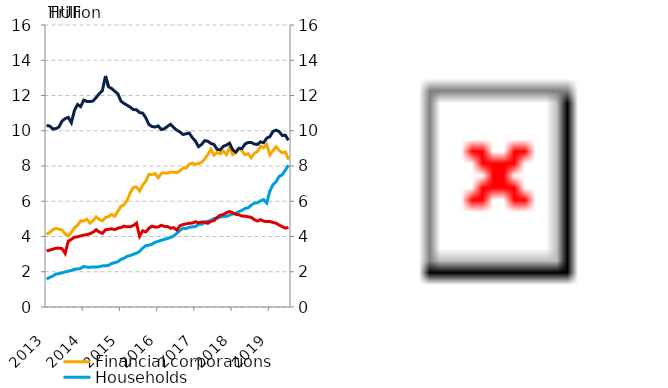
| Category | Financial corporations | Households |
|---|---|---|
| 2013-06-30 | 4.122 | 1.58 |
| 2013-07-31 | 4.225 | 1.681 |
| 2013-08-31 | 4.38 | 1.75 |
| 2013-09-30 | 4.46 | 1.872 |
| 2013-10-31 | 4.414 | 1.893 |
| 2013-11-30 | 4.366 | 1.935 |
| 2013-12-31 | 4.145 | 1.991 |
| 2014-01-31 | 4.032 | 2.036 |
| 2014-02-28 | 4.224 | 2.07 |
| 2014-03-31 | 4.491 | 2.148 |
| 2014-04-30 | 4.631 | 2.151 |
| 2014-05-31 | 4.888 | 2.186 |
| 2014-06-30 | 4.883 | 2.301 |
| 2014-07-31 | 4.984 | 2.265 |
| 2014-08-31 | 4.755 | 2.248 |
| 2014-09-30 | 4.91 | 2.27 |
| 2014-10-31 | 5.11 | 2.262 |
| 2014-11-30 | 4.966 | 2.287 |
| 2014-12-31 | 4.888 | 2.333 |
| 2015-01-31 | 5.077 | 2.336 |
| 2015-02-28 | 5.129 | 2.364 |
| 2015-03-31 | 5.259 | 2.472 |
| 2015-04-30 | 5.15 | 2.514 |
| 2015-05-31 | 5.437 | 2.57 |
| 2015-06-30 | 5.703 | 2.704 |
| 2015-07-31 | 5.799 | 2.766 |
| 2015-08-31 | 6.047 | 2.879 |
| 2015-09-30 | 6.487 | 2.922 |
| 2015-10-31 | 6.783 | 2.995 |
| 2015-11-30 | 6.806 | 3.051 |
| 2015-12-31 | 6.583 | 3.16 |
| 2016-01-31 | 6.924 | 3.34 |
| 2016-02-29 | 7.136 | 3.482 |
| 2016-03-31 | 7.526 | 3.506 |
| 2016-04-30 | 7.517 | 3.568 |
| 2016-05-31 | 7.568 | 3.667 |
| 2016-06-30 | 7.337 | 3.726 |
| 2016-07-31 | 7.579 | 3.779 |
| 2016-08-31 | 7.612 | 3.836 |
| 2016-09-30 | 7.589 | 3.888 |
| 2016-10-31 | 7.655 | 3.95 |
| 2016-11-30 | 7.646 | 4.034 |
| 2016-12-31 | 7.618 | 4.179 |
| 2017-01-31 | 7.727 | 4.344 |
| 2017-02-28 | 7.889 | 4.469 |
| 2017-03-31 | 7.879 | 4.451 |
| 2017-04-30 | 8.097 | 4.52 |
| 2017-05-31 | 8.164 | 4.543 |
| 2017-06-30 | 8.095 | 4.566 |
| 2017-07-31 | 8.135 | 4.683 |
| 2017-08-31 | 8.206 | 4.698 |
| 2017-09-30 | 8.405 | 4.767 |
| 2017-10-31 | 8.643 | 4.874 |
| 2017-11-30 | 8.949 | 4.902 |
| 2017-12-31 | 8.613 | 5.025 |
| 2018-01-31 | 8.768 | 5.04 |
| 2018-02-28 | 8.688 | 5.098 |
| 2018-03-31 | 8.833 | 5.132 |
| 2018-04-30 | 8.649 | 5.14 |
| 2018-05-31 | 9.028 | 5.208 |
| 2018-06-30 | 8.647 | 5.282 |
| 2018-07-31 | 8.762 | 5.324 |
| 2018-08-31 | 8.959 | 5.411 |
| 2018-09-30 | 8.866 | 5.484 |
| 2018-10-31 | 8.635 | 5.588 |
| 2018-11-30 | 8.7 | 5.625 |
| 2018-12-31 | 8.467 | 5.779 |
| 2019-01-31 | 8.719 | 5.898 |
| 2019-02-28 | 8.819 | 5.911 |
| 2019-03-31 | 9.115 | 6.018 |
| 2019-04-30 | 9.027 | 6.092 |
| 2019-05-31 | 9.222 | 5.901 |
| 2019-06-30 | 8.634 | 6.572 |
| 2019-07-31 | 8.873 | 6.935 |
| 2019-08-31 | 9.088 | 7.103 |
| 2019-09-30 | 8.888 | 7.407 |
| 2019-10-31 | 8.743 | 7.503 |
| 2019-11-30 | 8.797 | 7.764 |
| 2019-12-31 | 8.366 | 8.047 |